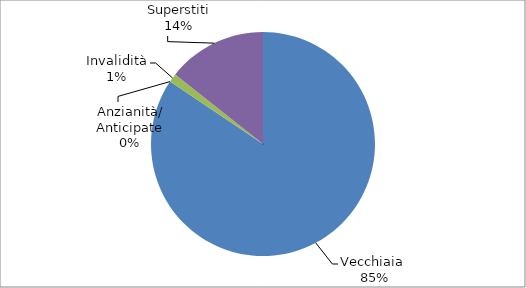
| Category | Series 0 |
|---|---|
| Vecchiaia  | 21132 |
| Anzianità/ Anticipate | 0 |
| Invalidità | 316 |
| Superstiti | 3588 |